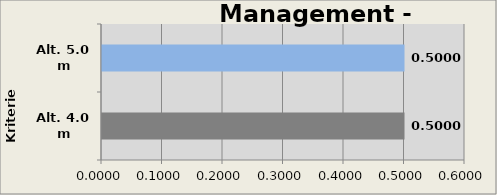
| Category | Management - C |
|---|---|
| Alt. 4.0 m | 0.5 |
| Alt. 5.0 m | 0.5 |